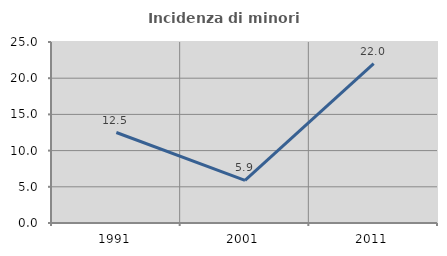
| Category | Incidenza di minori stranieri |
|---|---|
| 1991.0 | 12.5 |
| 2001.0 | 5.882 |
| 2011.0 | 22 |